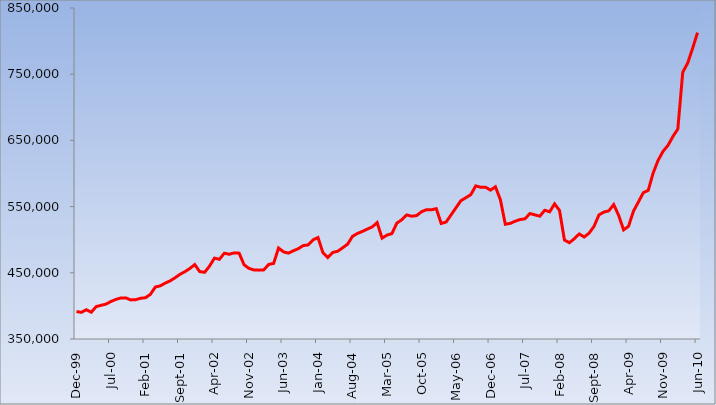
| Category | Total national government debt (R millions )    |
|---|---|
| 1999-12-01 | 391420 |
| 2000-01-01 | 390273 |
| 2000-02-01 | 394235 |
| 2000-03-01 | 390438 |
| 2000-04-01 | 398920 |
| 2000-05-01 | 400927 |
| 2000-06-01 | 402707 |
| 2000-07-01 | 406735 |
| 2000-08-01 | 409790 |
| 2000-09-01 | 411984 |
| 2000-10-01 | 412123 |
| 2000-11-01 | 409058 |
| 2000-12-01 | 409363 |
| 2001-01-01 | 411498 |
| 2001-02-01 | 412351 |
| 2001-03-01 | 417454 |
| 2001-04-01 | 428488 |
| 2001-05-01 | 430293 |
| 2001-06-01 | 434404 |
| 2001-07-01 | 437815 |
| 2001-08-01 | 442511 |
| 2001-09-01 | 447699 |
| 2001-10-01 | 451659 |
| 2001-11-01 | 456536 |
| 2001-12-01 | 462446 |
| 2002-01-01 | 451790 |
| 2002-02-01 | 450727 |
| 2002-03-01 | 460199 |
| 2002-04-01 | 472181 |
| 2002-05-01 | 470381 |
| 2002-06-01 | 479594 |
| 2002-07-01 | 478033 |
| 2002-08-01 | 480097 |
| 2002-09-01 | 479696 |
| 2002-10-01 | 462215 |
| 2002-11-01 | 456658 |
| 2002-12-01 | 454278 |
| 2003-01-01 | 454011 |
| 2003-02-01 | 454401 |
| 2003-03-01 | 462645 |
| 2003-04-01 | 464132 |
| 2003-05-01 | 487451 |
| 2003-06-01 | 481651 |
| 2003-07-01 | 479705 |
| 2003-08-01 | 483253 |
| 2003-09-01 | 486429 |
| 2003-10-01 | 491107 |
| 2003-11-01 | 492137 |
| 2003-12-01 | 499812 |
| 2004-01-01 | 503300 |
| 2004-02-01 | 480400 |
| 2004-03-01 | 473096 |
| 2004-04-01 | 480809 |
| 2004-05-01 | 482532 |
| 2004-06-01 | 487776 |
| 2004-07-01 | 493193 |
| 2004-08-01 | 505055 |
| 2004-09-01 | 509421 |
| 2004-10-01 | 512480 |
| 2004-11-01 | 516001 |
| 2004-12-01 | 519344 |
| 2005-01-01 | 525851 |
| 2005-02-01 | 502321 |
| 2005-03-01 | 506970 |
| 2005-04-01 | 509272 |
| 2005-05-01 | 525072 |
| 2005-06-01 | 530144 |
| 2005-07-01 | 537439 |
| 2005-08-01 | 535490 |
| 2005-09-01 | 536404 |
| 2005-10-01 | 542244 |
| 2005-11-01 | 545276 |
| 2005-12-01 | 545128 |
| 2006-01-01 | 546897 |
| 2006-02-01 | 524552 |
| 2006-03-01 | 526715 |
| 2006-04-01 | 537467 |
| 2006-05-01 | 548318 |
| 2006-06-01 | 559024 |
| 2006-07-01 | 563399 |
| 2006-08-01 | 568044 |
| 2006-09-01 | 581234 |
| 2006-10-01 | 579275 |
| 2006-11-01 | 579296 |
| 2006-12-01 | 574871 |
| 2007-01-01 | 579940 |
| 2007-02-01 | 560487 |
| 2007-03-01 | 523396 |
| 2007-04-01 | 524621 |
| 2007-05-01 | 527942 |
| 2007-06-01 | 530434 |
| 2007-07-01 | 531558 |
| 2007-08-01 | 539582 |
| 2007-09-01 | 537478 |
| 2007-10-01 | 535520 |
| 2007-11-01 | 544475 |
| 2007-12-01 | 542150 |
| 2008-01-01 | 554165 |
| 2008-02-01 | 544227 |
| 2008-03-01 | 499477 |
| 2008-04-01 | 495477 |
| 2008-05-01 | 501431 |
| 2008-06-01 | 508744 |
| 2008-07-01 | 504051 |
| 2008-08-01 | 509923 |
| 2008-09-01 | 520117 |
| 2008-10-01 | 537441 |
| 2008-11-01 | 541689 |
| 2008-12-01 | 543693 |
| 2009-01-01 | 553094 |
| 2009-02-01 | 536654 |
| 2009-03-01 | 514809 |
| 2009-04-01 | 520262 |
| 2009-05-01 | 543135 |
| 2009-06-01 | 556911 |
| 2009-07-01 | 571008 |
| 2009-08-01 | 574564 |
| 2009-09-01 | 600780 |
| 2009-10-01 | 619947 |
| 2009-11-01 | 633425 |
| 2009-12-01 | 642429 |
| 2010-01-01 | 655853 |
| 2010-02-01 | 667084 |
| 2010-03-01 | 752975 |
| 2010-04-01 | 766786 |
| 2010-05-01 | 788994 |
| 2010-06-01 | 812815 |